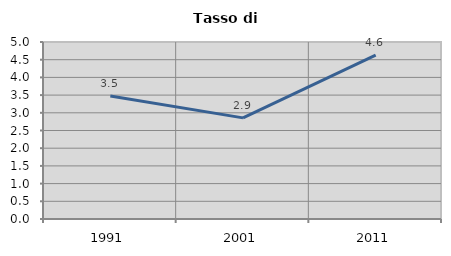
| Category | Tasso di disoccupazione   |
|---|---|
| 1991.0 | 3.472 |
| 2001.0 | 2.857 |
| 2011.0 | 4.63 |